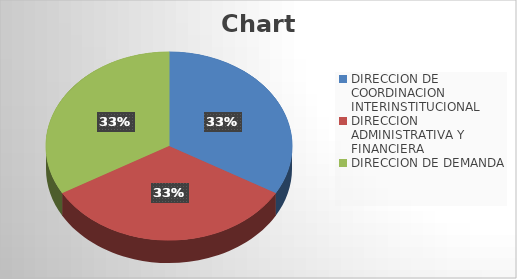
| Category | Series 0 |
|---|---|
| DIRECCION DE COORDINACION INTERINSTITUCIONAL | 4 |
| DIRECCION ADMINISTRATIVA Y FINANCIERA | 4 |
| DIRECCION DE DEMANDA | 4 |